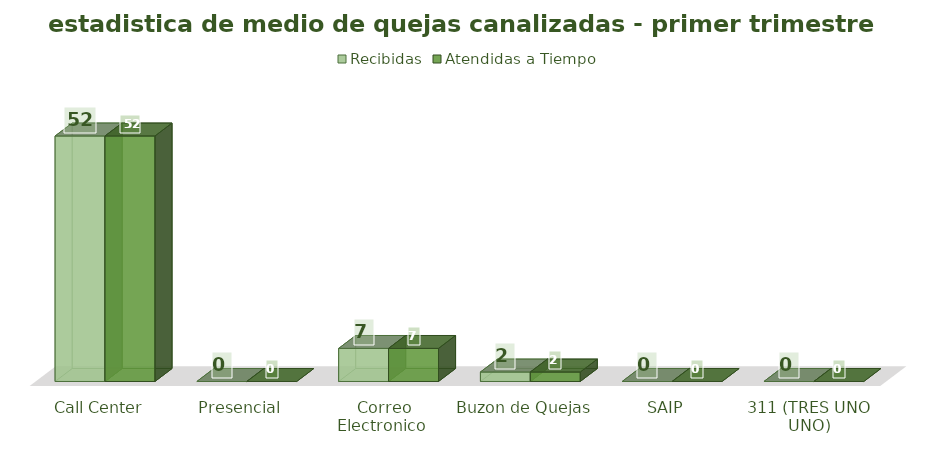
| Category | Recibidas | Atendidas a Tiempo |
|---|---|---|
| Call Center | 52 | 52 |
| Presencial | 0 | 0 |
| Correo Electronico  | 7 | 7 |
| Buzon de Quejas | 2 | 2 |
| SAIP | 0 | 0 |
| 311 (TRES UNO UNO) | 0 | 0 |